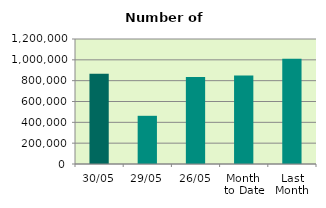
| Category | Series 0 |
|---|---|
| 30/05 | 866820 |
| 29/05 | 462682 |
| 26/05 | 835622 |
| Month 
to Date | 849268.095 |
| Last
Month | 1010681.333 |